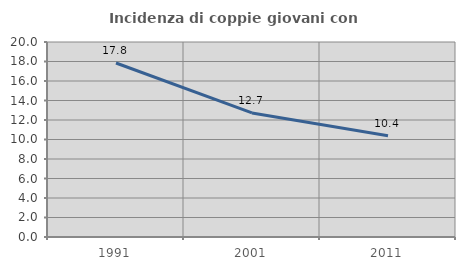
| Category | Incidenza di coppie giovani con figli |
|---|---|
| 1991.0 | 17.848 |
| 2001.0 | 12.727 |
| 2011.0 | 10.394 |